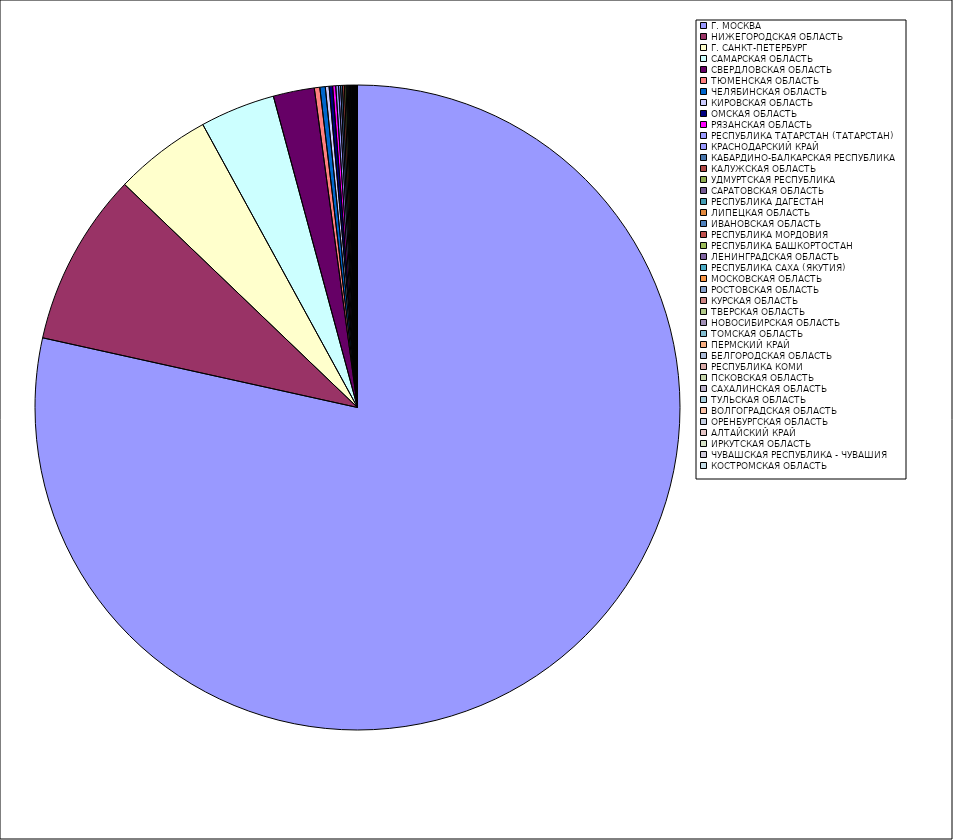
| Category | Оборот |
|---|---|
| Г. МОСКВА | 78.437 |
| НИЖЕГОРОДСКАЯ ОБЛАСТЬ | 8.688 |
| Г. САНКТ-ПЕТЕРБУРГ | 4.877 |
| САМАРСКАЯ ОБЛАСТЬ | 3.76 |
| СВЕРДЛОВСКАЯ ОБЛАСТЬ | 2.059 |
| ТЮМЕНСКАЯ ОБЛАСТЬ | 0.275 |
| ЧЕЛЯБИНСКАЯ ОБЛАСТЬ | 0.272 |
| КИРОВСКАЯ ОБЛАСТЬ | 0.189 |
| ОМСКАЯ ОБЛАСТЬ | 0.176 |
| РЯЗАНСКАЯ ОБЛАСТЬ | 0.153 |
| РЕСПУБЛИКА ТАТАРСТАН (ТАТАРСТАН) | 0.138 |
| КРАСНОДАРСКИЙ КРАЙ | 0.1 |
| КАБАРДИНО-БАЛКАРСКАЯ РЕСПУБЛИКА | 0.095 |
| КАЛУЖСКАЯ ОБЛАСТЬ | 0.095 |
| УДМУРТСКАЯ РЕСПУБЛИКА | 0.077 |
| САРАТОВСКАЯ ОБЛАСТЬ | 0.054 |
| РЕСПУБЛИКА ДАГЕСТАН | 0.049 |
| ЛИПЕЦКАЯ ОБЛАСТЬ | 0.043 |
| ИВАНОВСКАЯ ОБЛАСТЬ | 0.038 |
| РЕСПУБЛИКА МОРДОВИЯ | 0.036 |
| РЕСПУБЛИКА БАШКОРТОСТАН | 0.036 |
| ЛЕНИНГРАДСКАЯ ОБЛАСТЬ | 0.035 |
| РЕСПУБЛИКА САХА (ЯКУТИЯ) | 0.029 |
| МОСКОВСКАЯ ОБЛАСТЬ | 0.029 |
| РОСТОВСКАЯ ОБЛАСТЬ | 0.026 |
| КУРСКАЯ ОБЛАСТЬ | 0.025 |
| ТВЕРСКАЯ ОБЛАСТЬ | 0.023 |
| НОВОСИБИРСКАЯ ОБЛАСТЬ | 0.02 |
| ТОМСКАЯ ОБЛАСТЬ | 0.015 |
| ПЕРМСКИЙ КРАЙ | 0.014 |
| БЕЛГОРОДСКАЯ ОБЛАСТЬ | 0.012 |
| РЕСПУБЛИКА КОМИ | 0.01 |
| ПСКОВСКАЯ ОБЛАСТЬ | 0.01 |
| САХАЛИНСКАЯ ОБЛАСТЬ | 0.01 |
| ТУЛЬСКАЯ ОБЛАСТЬ | 0.009 |
| ВОЛГОГРАДСКАЯ ОБЛАСТЬ | 0.009 |
| ОРЕНБУРГСКАЯ ОБЛАСТЬ | 0.009 |
| АЛТАЙСКИЙ КРАЙ | 0.008 |
| ИРКУТСКАЯ ОБЛАСТЬ | 0.008 |
| ЧУВАШСКАЯ РЕСПУБЛИКА - ЧУВАШИЯ | 0.007 |
| КОСТРОМСКАЯ ОБЛАСТЬ | 0.007 |